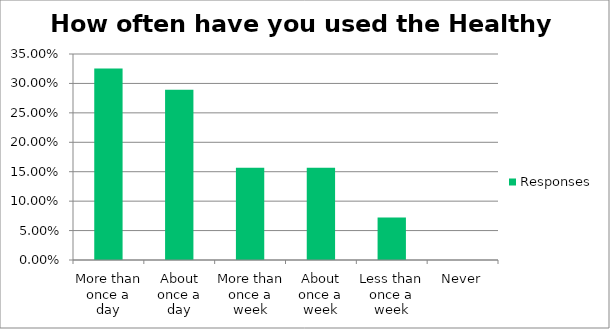
| Category | Responses |
|---|---|
| More than once a day | 0.325 |
| About once a day | 0.289 |
| More than once a week | 0.157 |
| About once a week | 0.157 |
| Less than once a week | 0.072 |
| Never | 0 |